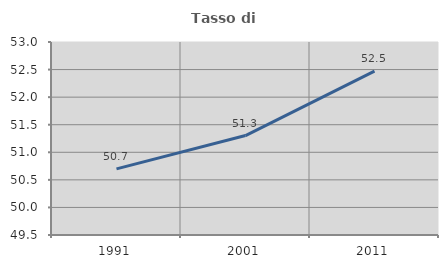
| Category | Tasso di occupazione   |
|---|---|
| 1991.0 | 50.7 |
| 2001.0 | 51.304 |
| 2011.0 | 52.473 |